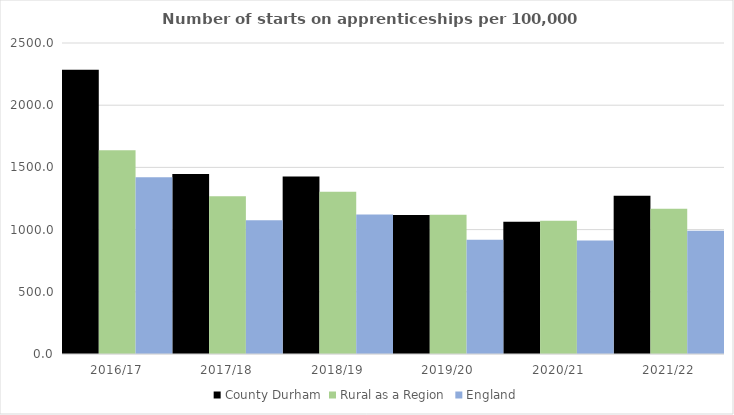
| Category | County Durham | Rural as a Region | England |
|---|---|---|---|
| 2016/17 | 2284 | 1638.789 | 1420 |
| 2017/18 | 1447 | 1267.474 | 1075 |
| 2018/19 | 1427 | 1304.57 | 1122 |
| 2019/20 | 1118 | 1119.662 | 918 |
| 2020/21 | 1063 | 1070.748 | 912 |
| 2021/22 | 1272 | 1167.68 | 991 |